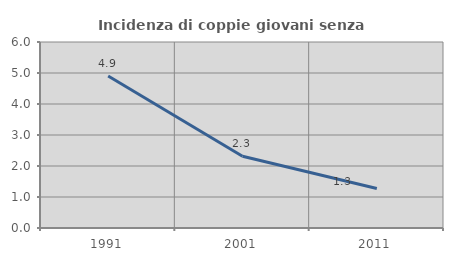
| Category | Incidenza di coppie giovani senza figli |
|---|---|
| 1991.0 | 4.902 |
| 2001.0 | 2.315 |
| 2011.0 | 1.277 |